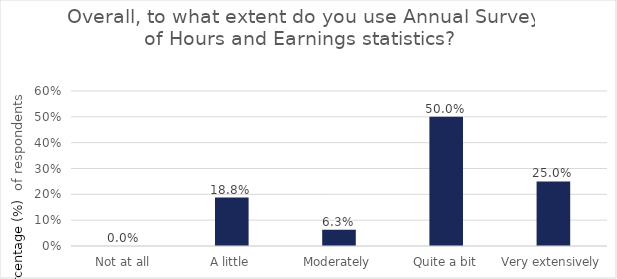
| Category | Series 0 |
|---|---|
| Not at all | 0 |
| A little | 0.188 |
| Moderately | 0.062 |
| Quite a bit | 0.5 |
| Very extensively | 0.25 |